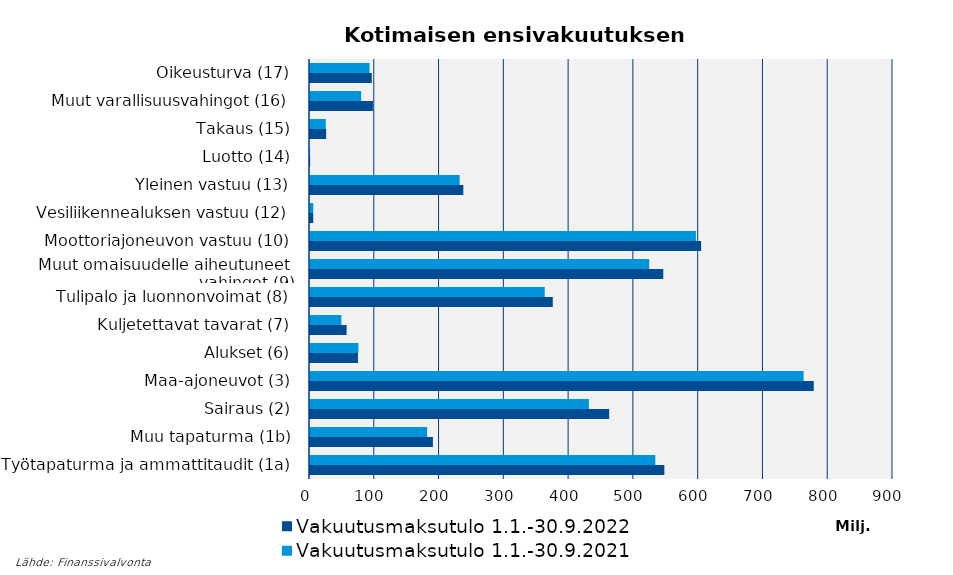
| Category | Vakuutusmaksutulo |
|---|---|
| Työtapaturma ja ammattitaudit (1a) | 533080.547 |
| Muu tapaturma (1b) | 180782.275 |
| Sairaus (2) | 430573.208 |
| Maa-ajoneuvot (3) | 761963.445 |
| Alukset (6) | 74783.445 |
| Kuljetettavat tavarat (7) | 48396.317 |
| Tulipalo ja luonnonvoimat (8) | 362357.53 |
| Muut omaisuudelle aiheutuneet 
vahingot (9) | 523647.256 |
| Moottoriajoneuvon vastuu (10) | 595709.309 |
| Vesiliikennealuksen vastuu (12) | 5033.968 |
| Yleinen vastuu (13) | 231048.151 |
| Luotto (14) | 204.189 |
| Takaus (15) | 24357.257 |
| Muut varallisuusvahingot (16) | 78995.253 |
| Oikeusturva (17) | 91908.641 |